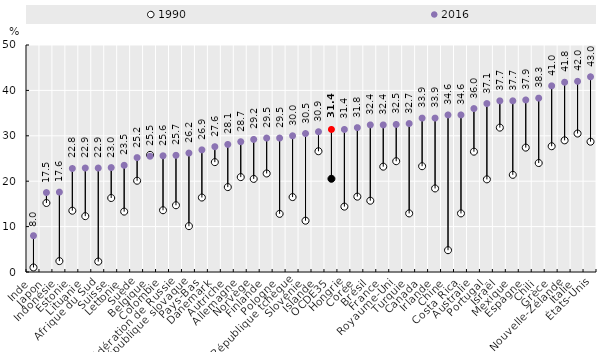
| Category | 1990 | 2016 |
|---|---|---|
| Inde | 1 | 8 |
| Japon | 15.2 | 17.5 |
| Indonésie | 2.4 | 17.6 |
| Estonie | 13.5 | 22.8 |
| Lituanie | 12.3 | 22.9 |
| Afrique du Sud | 2.3 | 22.9 |
| Suisse | 16.3 | 23 |
| Lettonie | 13.3 | 23.5 |
| Suède | 20.1 | 25.2 |
| Belgique | 25.8 | 25.5 |
| Colombie | 13.6 | 25.6 |
| Fédération de Russie | 14.7 | 25.7 |
| République slovaque | 10.1 | 26.2 |
| Pays-Bas | 16.4 | 26.9 |
| Danemark | 24.2 | 27.6 |
| Autriche | 18.7 | 28.1 |
| Allemagne | 20.9 | 28.7 |
| Norvège | 20.5 | 29.2 |
| Finlande | 21.7 | 29.5 |
| Pologne | 12.8 | 29.5 |
| République tchèque | 16.5 | 30 |
| Slovénie | 11.3 | 30.5 |
| Islande | 26.6 | 30.9 |
| OCDE35 | 20.531 | 31.4 |
| Hongrie | 14.4 | 31.4 |
| Corée | 16.6 | 31.8 |
| Brésil | 15.7 | 32.4 |
| France | 23.2 | 32.4 |
| Royaume-Uni | 24.4 | 32.5 |
| Turquie | 12.9 | 32.7 |
| Canada | 23.3 | 33.9 |
| Irlande | 18.4 | 33.9 |
| Chine | 4.8 | 34.6 |
| Costa Rica | 12.9 | 34.6 |
| Australie | 26.5 | 36 |
| Portugal | 20.4 | 37.1 |
| Israël | 31.8 | 37.7 |
| Mexique | 21.4 | 37.7 |
| Espagne | 27.4 | 37.9 |
| Chili | 24 | 38.3 |
| Grèce | 27.7 | 41 |
| Nouvelle-Zélande | 29 | 41.8 |
| Italie | 30.5 | 42 |
| États-Unis | 28.7 | 43 |